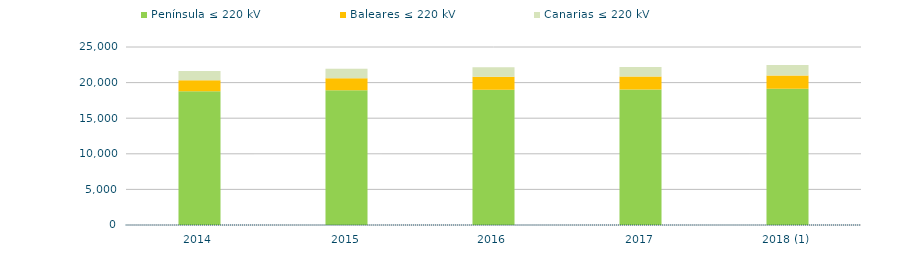
| Category | Península ≤ 220 kV | Baleares ≤ 220 kV | Canarias ≤ 220 kV |
|---|---|---|---|
| 2014 | 18784.959 | 1544.972 | 1289.135 |
| 2015 | 18925.262 | 1673.682 | 1346.959 |
| 2016 | 19013.239 | 1800.036 | 1354.165 |
| 2017 | 19038.601 | 1808.319 | 1355.097 |
| 2018 (1) | 19132.893 | 1853.622 | 1490.559 |